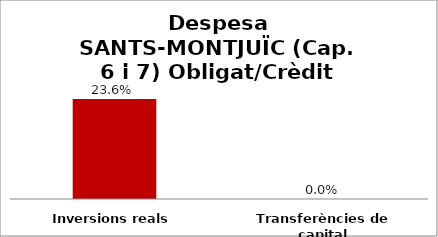
| Category | Series 0 |
|---|---|
| Inversions reals | 0.236 |
| Transferències de capital | 0 |